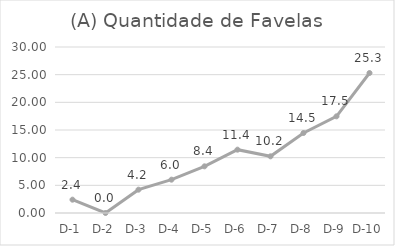
| Category | FAVELA(S/N) |
|---|---|
| D-1 | 2.41 |
| D-2 | 0 |
| D-3 | 4.217 |
| D-4 | 6.024 |
| D-5 | 8.434 |
| D-6 | 11.446 |
| D-7 | 10.241 |
| D-8 | 14.458 |
| D-9 | 17.47 |
| D-10 | 25.301 |